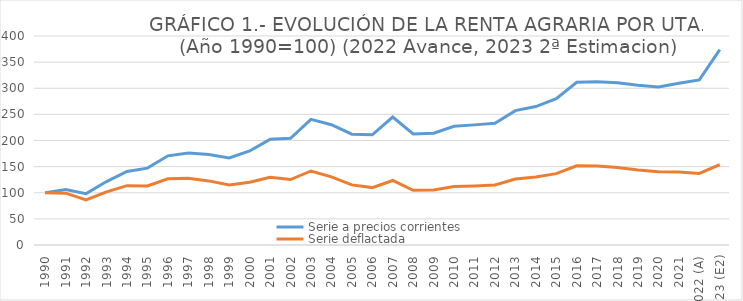
| Category | Serie a precios corrientes | Serie deflactada |
|---|---|---|
| 1990 | 100 | 100 |
| 1991 | 106.022 | 99.142 |
| 1992 | 98.347 | 86.183 |
| 1993 | 121.453 | 101.812 |
| 1994 | 140.695 | 113.537 |
| 1995 | 147.092 | 113.119 |
| 1996 | 170.668 | 126.785 |
| 1997 | 176.173 | 127.908 |
| 1998 | 173.044 | 122.689 |
| 1999 | 166.597 | 115.013 |
| 2000 | 179.963 | 120.038 |
| 2001 | 202.251 | 129.477 |
| 2002 | 204.311 | 125.34 |
| 2003 | 240.588 | 141.696 |
| 2004 | 230.215 | 130.319 |
| 2005 | 212.011 | 115.018 |
| 2006 | 210.895 | 109.864 |
| 2007 | 244.846 | 123.514 |
| 2008 | 212.633 | 104.775 |
| 2009 | 213.903 | 105.321 |
| 2010 | 227.256 | 111.807 |
| 2011 | 229.906 | 113.133 |
| 2012 | 233.164 | 114.868 |
| 2013 | 257.203 | 126.208 |
| 2014 | 264.895 | 130.084 |
| 2015 | 279.903 | 136.524 |
| 2016 | 311.515 | 151.645 |
| 2017 | 312.483 | 150.959 |
| 2018 | 310.608 | 148.41 |
| 2019 | 305.61 | 143.408 |
| 2020 | 302.615 | 140.089 |
| 2021 | 309.511 | 139.695 |
| 2022 (A) | 315.996 | 136.949 |
| 2023 (E2) | 373.772 | 153.902 |